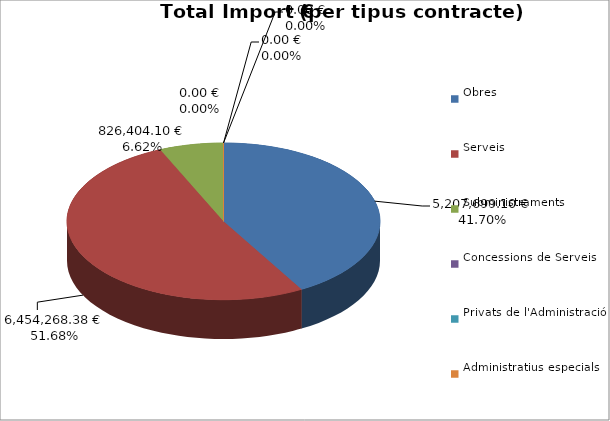
| Category | Total preu
(amb IVA) |
|---|---|
| Obres | 5207699.1 |
| Serveis | 6454268.38 |
| Subministraments | 826404.1 |
| Concessions de Serveis | 0 |
| Privats de l'Administració | 0 |
| Administratius especials | 0 |